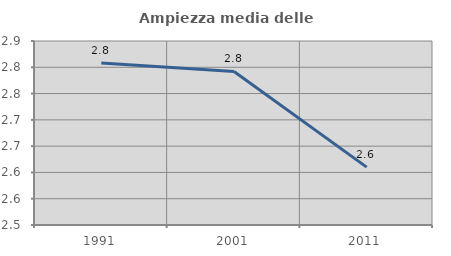
| Category | Ampiezza media delle famiglie |
|---|---|
| 1991.0 | 2.808 |
| 2001.0 | 2.792 |
| 2011.0 | 2.61 |